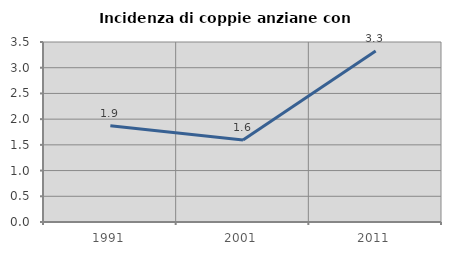
| Category | Incidenza di coppie anziane con figli |
|---|---|
| 1991.0 | 1.872 |
| 2001.0 | 1.596 |
| 2011.0 | 3.327 |